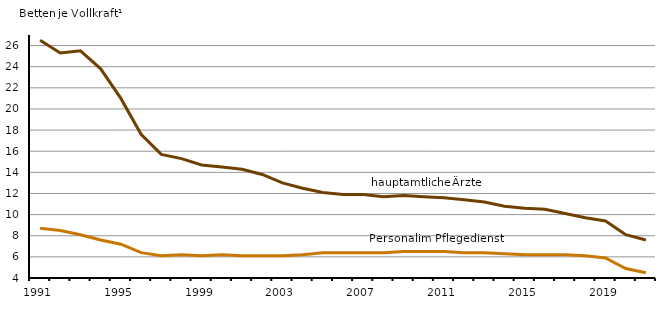
| Category | hautamtliche Ärzte | Personal im Pflegedienst |
|---|---|---|
| 1991.0 | 26.5 | 8.7 |
| 1992.0 | 25.3 | 8.5 |
| 1993.0 | 25.5 | 8.1 |
| 1994.0 | 23.8 | 7.6 |
| 1995.0 | 21 | 7.2 |
| 1996.0 | 17.6 | 6.4 |
| 1997.0 | 15.7 | 6.1 |
| 1998.0 | 15.3 | 6.2 |
| 1999.0 | 14.7 | 6.1 |
| 2000.0 | 14.5 | 6.2 |
| 2001.0 | 14.3 | 6.1 |
| 2002.0 | 13.8 | 6.1 |
| 2003.0 | 13 | 6.1 |
| 2004.0 | 12.5 | 6.2 |
| 2005.0 | 12.1 | 6.4 |
| 2006.0 | 11.9 | 6.4 |
| 2007.0 | 11.9 | 6.4 |
| 2008.0 | 11.7 | 6.4 |
| 2009.0 | 11.8 | 6.5 |
| 2010.0 | 11.7 | 6.5 |
| 2011.0 | 11.6 | 6.5 |
| 2012.0 | 11.4 | 6.4 |
| 2013.0 | 11.2 | 6.4 |
| 2014.0 | 10.8 | 6.3 |
| 2015.0 | 10.6 | 6.2 |
| 2016.0 | 10.5 | 6.2 |
| 2017.0 | 10.1 | 6.2 |
| 2018.0 | 9.7 | 6.1 |
| 2019.0 | 9.4 | 5.9 |
| 2020.0 | 8.1 | 4.9 |
| 2021.0 | 7.6 | 4.5 |